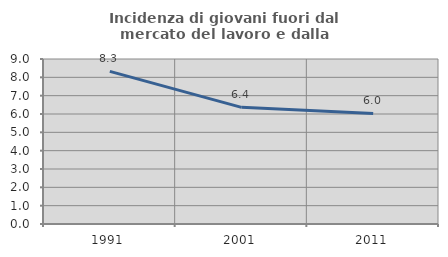
| Category | Incidenza di giovani fuori dal mercato del lavoro e dalla formazione  |
|---|---|
| 1991.0 | 8.323 |
| 2001.0 | 6.363 |
| 2011.0 | 6.034 |